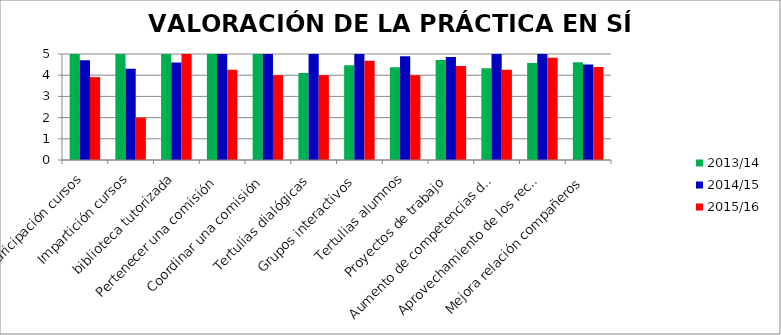
| Category | 2013/14 | 2014/15 | 2015/16 |
|---|---|---|---|
| Paricipación cursos | 5 | 4.7 | 3.91 |
| Impartición cursos | 5 | 4.3 | 2 |
| biblioteca tutorizada | 5 | 4.6 | 5 |
| Pertenecer una comisión | 5 | 5 | 4.26 |
| Coordinar una comisión | 5 | 5 | 4 |
| Tertulias dialógicas | 4.1 | 5 | 4 |
| Grupos interactivos | 4.47 | 5 | 4.68 |
| Tertulias alumnos | 4.37 | 4.89 | 4 |
| Proyectos de trabajo | 4.72 | 4.86 | 4.43 |
| Aumento de competencias docentes | 4.33 | 5 | 4.26 |
| Aprovechamiento de los recursos | 4.57 | 5 | 4.82 |
| Mejora relación compañeros | 4.61 | 4.5 | 4.39 |